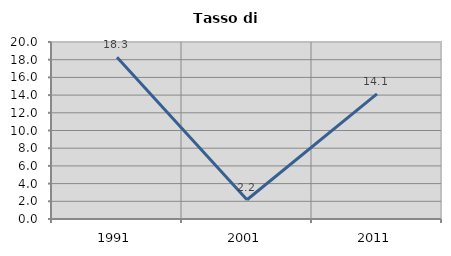
| Category | Tasso di disoccupazione   |
|---|---|
| 1991.0 | 18.274 |
| 2001.0 | 2.174 |
| 2011.0 | 14.141 |